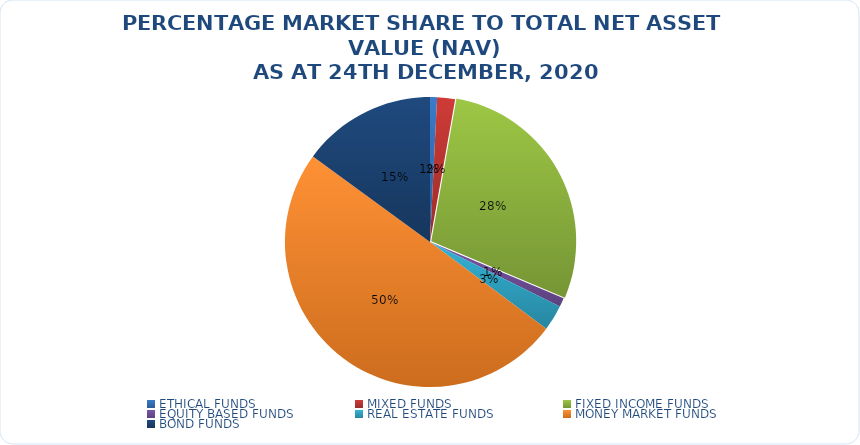
| Category | NET ASSET VALUE |
|---|---|
| ETHICAL FUNDS | 11583636280.93 |
| MIXED FUNDS | 29456136497.551 |
| FIXED INCOME FUNDS | 422660885839.034 |
| EQUITY BASED FUNDS | 14706374811.54 |
| REAL ESTATE FUNDS | 42278201949.369 |
| MONEY MARKET FUNDS | 737255326040.852 |
| BOND FUNDS | 221204355591.56 |